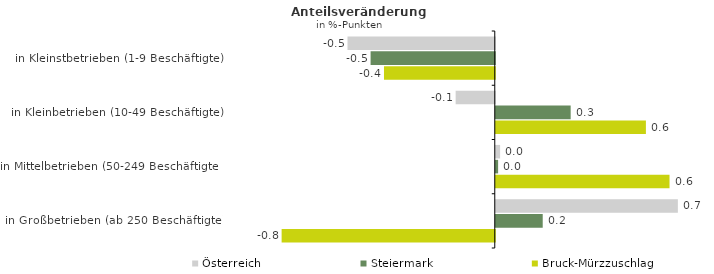
| Category | Österreich | Steiermark | Bruck-Mürzzuschlag |
|---|---|---|---|
| in Kleinstbetrieben (1-9 Beschäftigte) | -0.55 | -0.464 | -0.414 |
| in Kleinbetrieben (10-49 Beschäftigte) | -0.146 | 0.28 | 0.561 |
| in Mittelbetrieben (50-249 Beschäftigte) | 0.016 | 0.009 | 0.649 |
| in Großbetrieben (ab 250 Beschäftigte) | 0.68 | 0.175 | -0.796 |